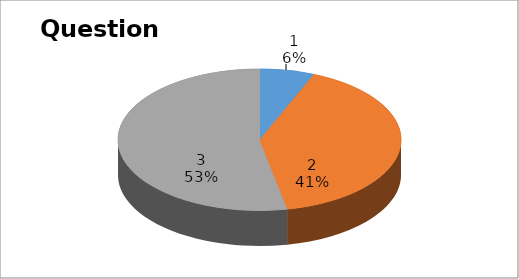
| Category | Series 0 |
|---|---|
| 0 | 2 |
| 1 | 13 |
| 2 | 17 |